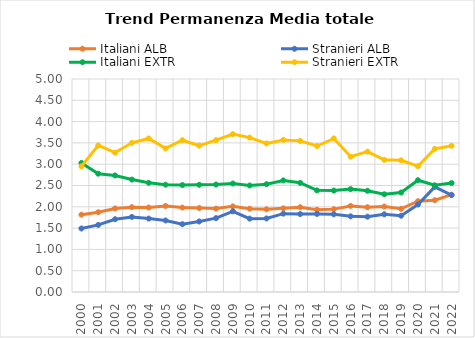
| Category | Italiani ALB | Stranieri ALB | Italiani EXTR | Stranieri EXTR |
|---|---|---|---|---|
| 2000.0 | 1.815 | 1.491 | 3.03 | 2.948 |
| 2001.0 | 1.873 | 1.575 | 2.777 | 3.441 |
| 2002.0 | 1.961 | 1.709 | 2.736 | 3.272 |
| 2003.0 | 1.992 | 1.762 | 2.639 | 3.502 |
| 2004.0 | 1.984 | 1.724 | 2.563 | 3.604 |
| 2005.0 | 2.019 | 1.679 | 2.519 | 3.371 |
| 2006.0 | 1.982 | 1.592 | 2.511 | 3.563 |
| 2007.0 | 1.971 | 1.656 | 2.516 | 3.437 |
| 2008.0 | 1.958 | 1.733 | 2.523 | 3.565 |
| 2009.0 | 2.01 | 1.894 | 2.547 | 3.707 |
| 2010.0 | 1.956 | 1.722 | 2.5 | 3.624 |
| 2011.0 | 1.941 | 1.726 | 2.531 | 3.489 |
| 2012.0 | 1.965 | 1.839 | 2.619 | 3.57 |
| 2013.0 | 1.99 | 1.829 | 2.563 | 3.548 |
| 2014.0 | 1.933 | 1.833 | 2.386 | 3.427 |
| 2015.0 | 1.945 | 1.825 | 2.381 | 3.605 |
| 2016.0 | 2.02 | 1.776 | 2.415 | 3.177 |
| 2017.0 | 1.99 | 1.768 | 2.376 | 3.295 |
| 2018.0 | 2.006 | 1.824 | 2.294 | 3.102 |
| 2019.0 | 1.953 | 1.79 | 2.336 | 3.09 |
| 2020.0 | 2.131 | 2.053 | 2.624 | 2.954 |
| 2021.0 | 2.155 | 2.466 | 2.505 | 3.361 |
| 2022.0 | 2.285 | 2.274 | 2.557 | 3.433 |